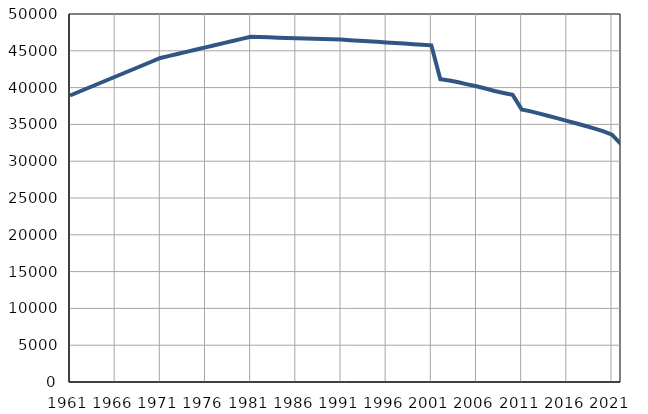
| Category | Population
size |
|---|---|
| 1961.0 | 38925 |
| 1962.0 | 39435 |
| 1963.0 | 39944 |
| 1964.0 | 40454 |
| 1965.0 | 40964 |
| 1966.0 | 41473 |
| 1967.0 | 41983 |
| 1968.0 | 42493 |
| 1969.0 | 43003 |
| 1970.0 | 43511 |
| 1971.0 | 44022 |
| 1972.0 | 44310 |
| 1973.0 | 44598 |
| 1974.0 | 44886 |
| 1975.0 | 45174 |
| 1976.0 | 45462 |
| 1977.0 | 45750 |
| 1978.0 | 46038 |
| 1979.0 | 46326 |
| 1980.0 | 46614 |
| 1981.0 | 46902 |
| 1982.0 | 46865 |
| 1983.0 | 46827 |
| 1984.0 | 46789 |
| 1985.0 | 46751 |
| 1986.0 | 46714 |
| 1987.0 | 46676 |
| 1988.0 | 46637 |
| 1989.0 | 46600 |
| 1990.0 | 46563 |
| 1991.0 | 46525 |
| 1992.0 | 46447 |
| 1993.0 | 46370 |
| 1994.0 | 46291 |
| 1995.0 | 46214 |
| 1996.0 | 46137 |
| 1997.0 | 46059 |
| 1998.0 | 45982 |
| 1999.0 | 45904 |
| 2000.0 | 45826 |
| 2001.0 | 45749 |
| 2002.0 | 41144 |
| 2003.0 | 40960 |
| 2004.0 | 40720 |
| 2005.0 | 40438 |
| 2006.0 | 40178 |
| 2007.0 | 39869 |
| 2008.0 | 39540 |
| 2009.0 | 39277 |
| 2010.0 | 39027 |
| 2011.0 | 37041 |
| 2012.0 | 36767 |
| 2013.0 | 36464 |
| 2014.0 | 36143 |
| 2015.0 | 35818 |
| 2016.0 | 35485 |
| 2017.0 | 35149 |
| 2018.0 | 34810 |
| 2019.0 | 34465 |
| 2020.0 | 34077 |
| 2021.0 | 33612 |
| 2022.0 | 32315 |